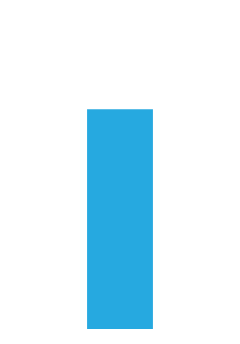
| Category | Percent Goal |
|---|---|
| 0 | 1 |